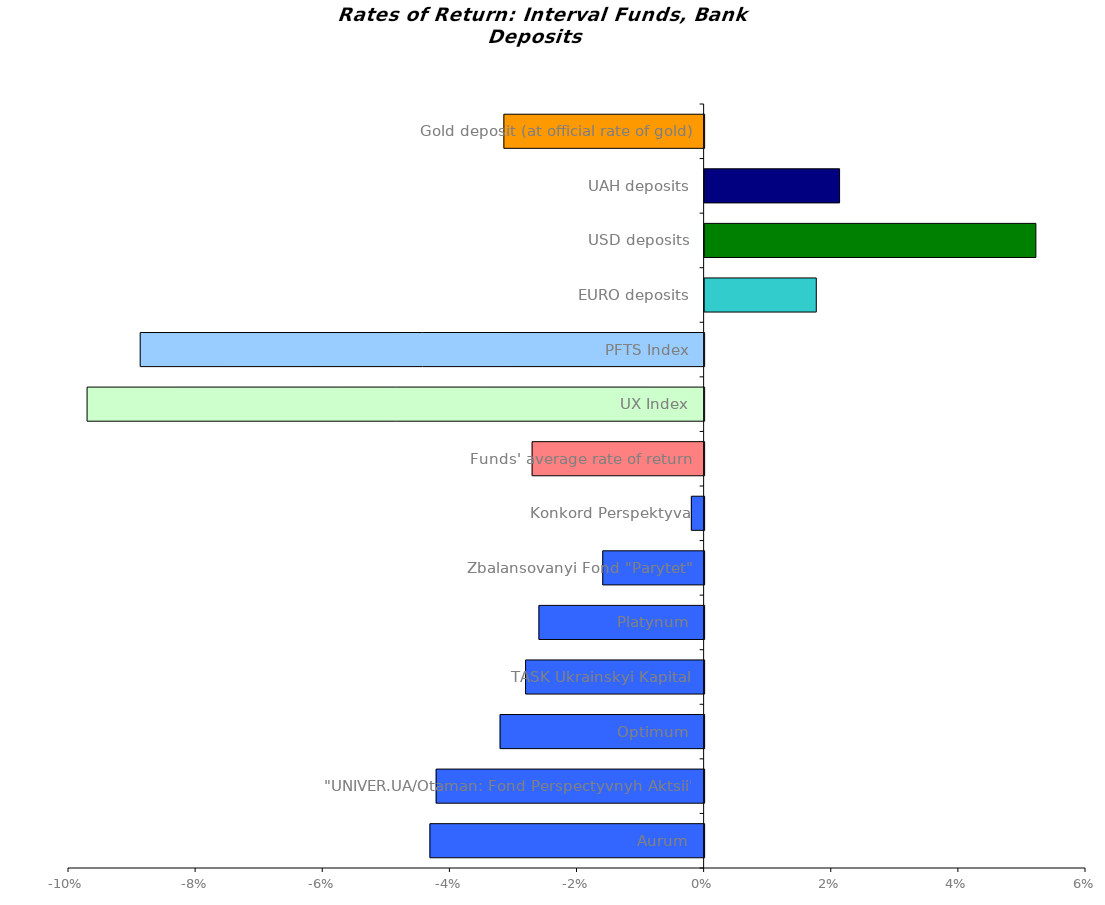
| Category | Series 0 |
|---|---|
| Aurum | -0.043 |
| "UNIVER.UA/Otaman: Fond Perspectyvnyh Aktsii" | -0.042 |
| Optimum | -0.032 |
| TASK Ukrainskyi Kapital | -0.028 |
| Platynum | -0.026 |
| Zbalansovanyi Fond "Parytet" | -0.016 |
| Konkord Perspektyva | -0.002 |
| Funds' average rate of return | -0.027 |
| UX Index | -0.097 |
| PFTS Index | -0.089 |
| EURO deposits | 0.018 |
| USD deposits | 0.052 |
| UAH deposits | 0.021 |
| Gold deposit (at official rate of gold) | -0.032 |